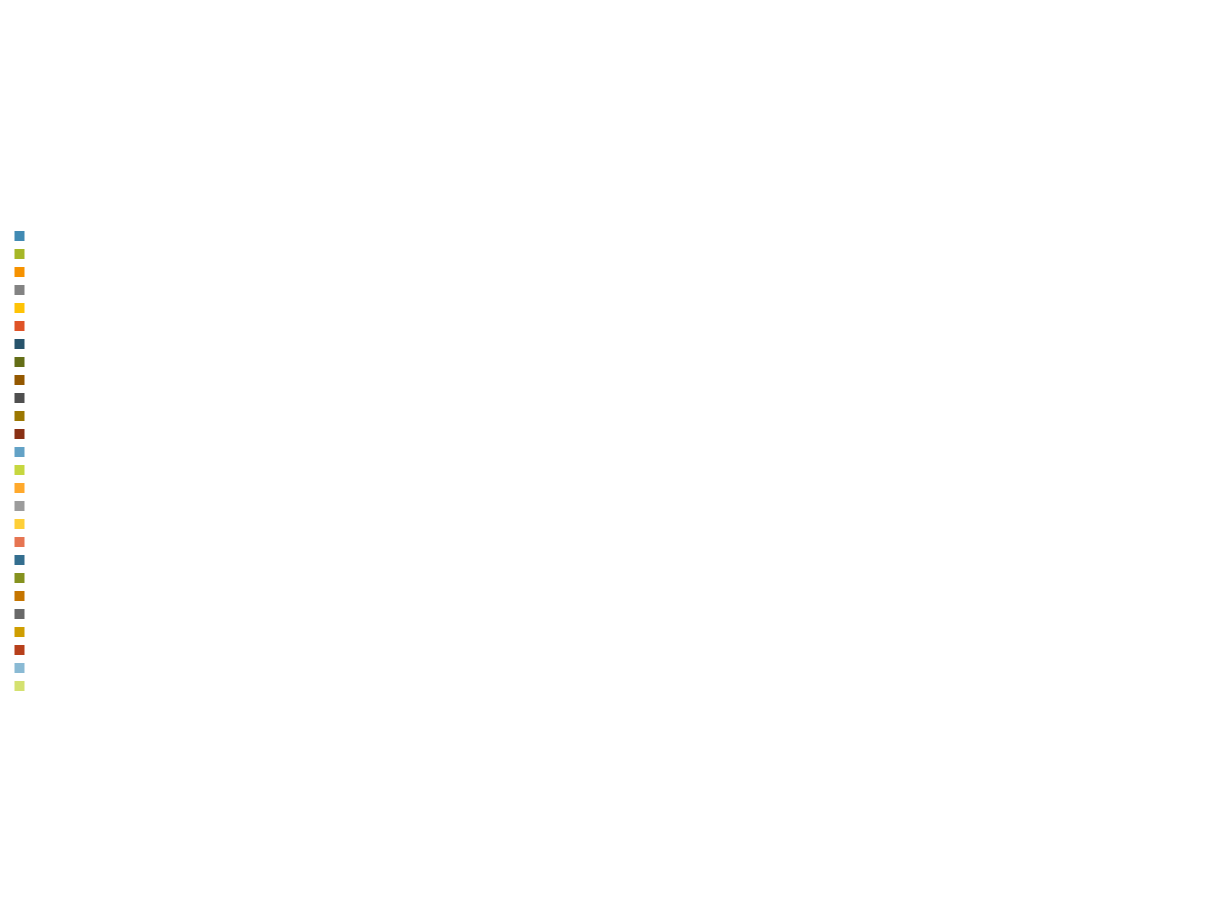
| Category | WEEKLY TOTALS 
IN MINS |
|---|---|
|  | 0 |
|  | 0 |
|  | 0 |
|  | 0 |
|  | 0 |
|  | 0 |
|  | 0 |
|  | 0 |
|  | 0 |
|  | 0 |
|  | 0 |
|  | 0 |
|  | 0 |
|  | 0 |
|  | 0 |
|  | 0 |
|  | 0 |
|  | 0 |
|  | 0 |
|  | 0 |
|  | 0 |
|  | 0 |
|  | 0 |
|  | 0 |
|  | 0 |
|  | 0 |